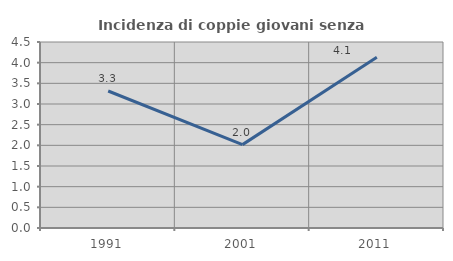
| Category | Incidenza di coppie giovani senza figli |
|---|---|
| 1991.0 | 3.315 |
| 2001.0 | 2.017 |
| 2011.0 | 4.13 |